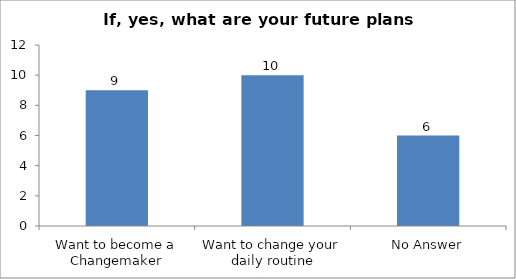
| Category | If, yes, what are your future plans now? |
|---|---|
| Want to become a Changemaker | 9 |
| Want to change your daily routine | 10 |
| No Answer | 6 |